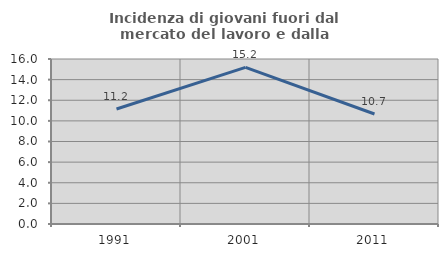
| Category | Incidenza di giovani fuori dal mercato del lavoro e dalla formazione  |
|---|---|
| 1991.0 | 11.152 |
| 2001.0 | 15.188 |
| 2011.0 | 10.664 |